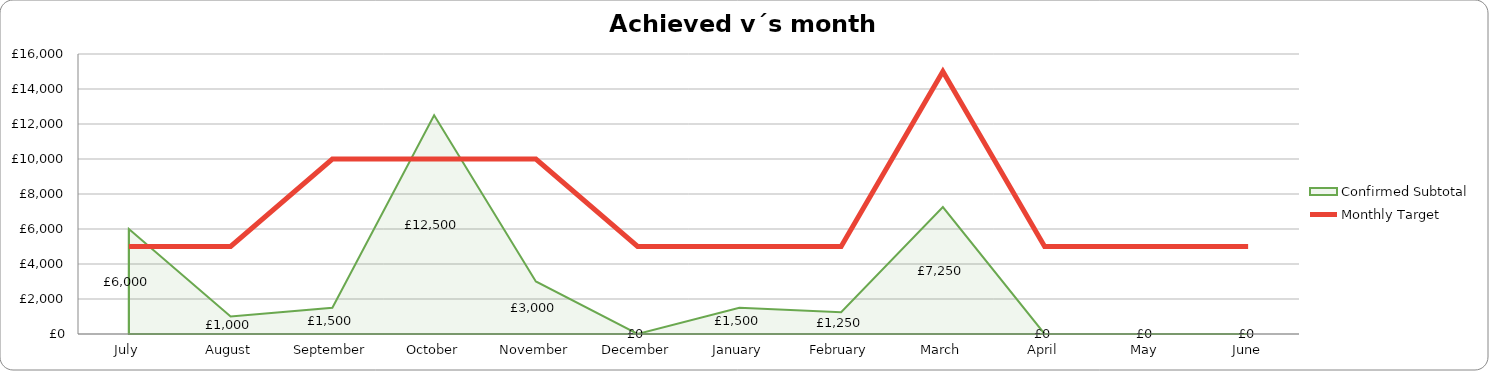
| Category | Monthly Target |
|---|---|
| 2019-07-01 | 5000 |
| 2019-08-01 | 5000 |
| 2019-09-01 | 10000 |
| 2019-10-01 | 10000 |
| 2019-11-01 | 10000 |
| 2019-12-01 | 5000 |
| 2020-01-01 | 5000 |
| 2020-02-01 | 5000 |
| 2020-03-01 | 15000 |
| 2020-04-01 | 5000 |
| 2020-05-01 | 5000 |
| 2020-06-01 | 5000 |